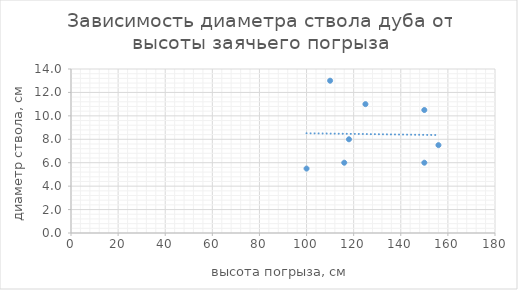
| Category | Series 0 |
|---|---|
| 156.0 | 7.5 |
| 118.0 | 8 |
| 150.0 | 6 |
| 100.0 | 5.5 |
| 150.0 | 10.5 |
| 116.0 | 6 |
| 110.0 | 13 |
| 125.0 | 11 |